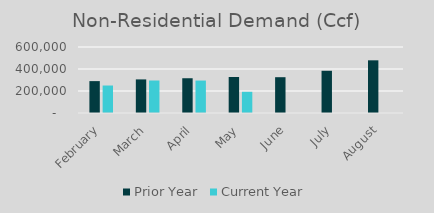
| Category | Prior Year | Current Year |
|---|---|---|
| February | 289857 | 249807 |
| March | 305426 | 295423 |
| April | 315985 | 295012.49 |
| May | 327135 | 192797 |
| June | 325420 | 0 |
| July | 383814 | 0 |
| August | 478930 | 0 |